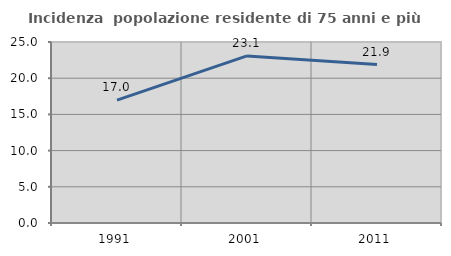
| Category | Incidenza  popolazione residente di 75 anni e più |
|---|---|
| 1991.0 | 16.98 |
| 2001.0 | 23.077 |
| 2011.0 | 21.883 |